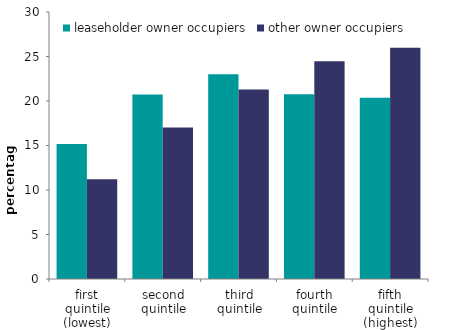
| Category | leaseholder owner occupiers | other owner occupiers |
|---|---|---|
| first quintile (lowest) | 15.172 | 11.215 |
| second quintile | 20.723 | 17.027 |
| third quintile | 22.999 | 21.297 |
| fourth quintile | 20.754 | 24.465 |
| fifth quintile (highest) | 20.352 | 25.996 |